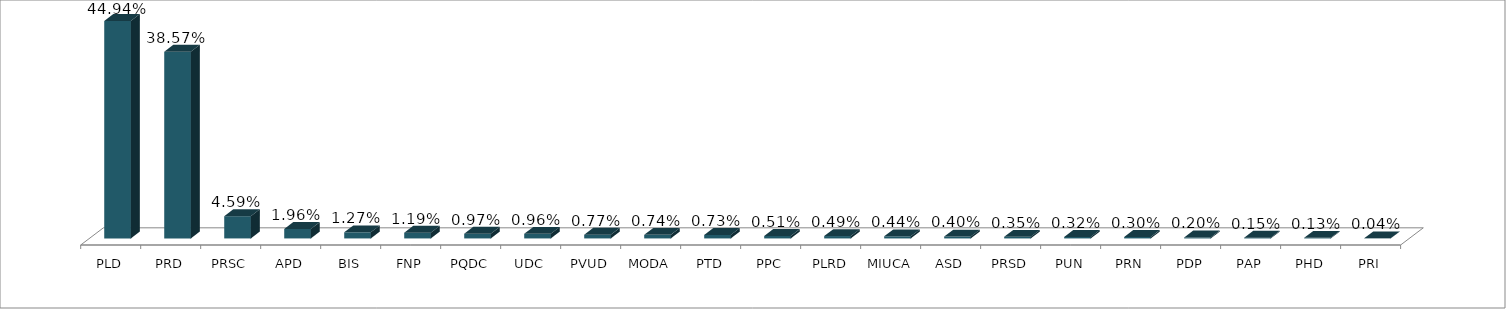
| Category | Votos % |
|---|---|
| PLD | 0.449 |
| PRD | 0.386 |
| PRSC | 0.046 |
| APD | 0.02 |
| BIS | 0.013 |
| FNP | 0.012 |
| PQDC | 0.01 |
| UDC | 0.01 |
| PVUD | 0.008 |
| MODA | 0.007 |
| PTD | 0.007 |
| PPC | 0.005 |
| PLRD | 0.005 |
| MIUCA | 0.004 |
| ASD | 0.004 |
| PRSD | 0.003 |
| PUN | 0.003 |
| PRN | 0.003 |
| PDP | 0.002 |
| PAP | 0.001 |
| PHD | 0.001 |
| PRI | 0 |